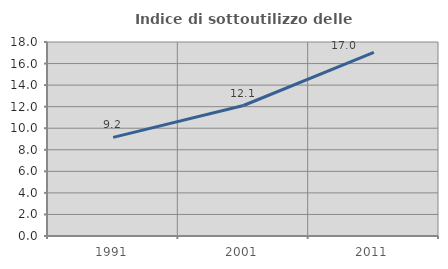
| Category | Indice di sottoutilizzo delle abitazioni  |
|---|---|
| 1991.0 | 9.15 |
| 2001.0 | 12.108 |
| 2011.0 | 17.047 |